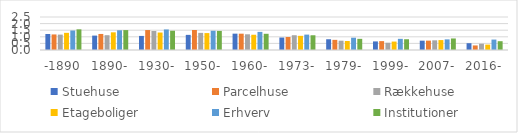
| Category | Stuehuse | Parcelhuse | Rækkehuse | Etageboliger | Erhverv | Institutioner |
|---|---|---|---|---|---|---|
| -1890 | 1.211 | 1.179 | 1.165 | 1.299 | 1.477 | 1.566 |
| 1890- | 1.091 | 1.216 | 1.122 | 1.339 | 1.494 | 1.509 |
| 1930- | 1.066 | 1.512 | 1.439 | 1.324 | 1.557 | 1.459 |
| 1950- | 1.147 | 1.517 | 1.298 | 1.282 | 1.458 | 1.446 |
| 1960- | 1.238 | 1.236 | 1.19 | 1.155 | 1.372 | 1.227 |
| 1973- | 0.944 | 0.984 | 1.119 | 1.073 | 1.167 | 1.117 |
| 1979- | 0.815 | 0.768 | 0.705 | 0.684 | 0.932 | 0.845 |
| 1999- | 0.651 | 0.673 | 0.55 | 0.64 | 0.845 | 0.816 |
| 2007- | 0.707 | 0.71 | 0.733 | 0.751 | 0.806 | 0.874 |
| 2016- | 0.516 | 0.345 | 0.474 | 0.409 | 0.79 | 0.666 |